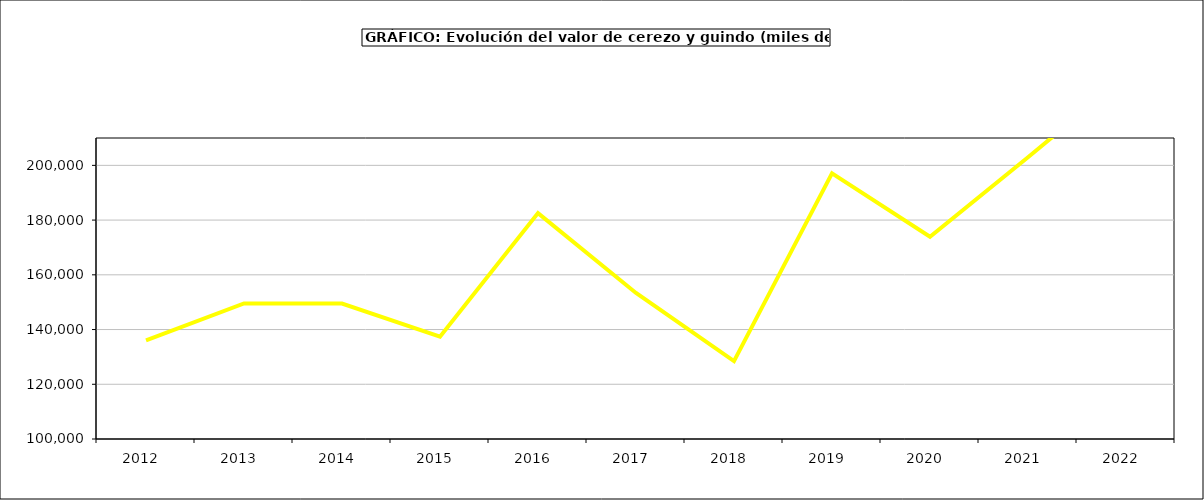
| Category | valor cerezo y guindo |
|---|---|
| 2012.0 | 136005.543 |
| 2013.0 | 149538.377 |
| 2014.0 | 149493.495 |
| 2015.0 | 137364 |
| 2016.0 | 182544 |
| 2017.0 | 153374.55 |
| 2018.0 | 128453.5 |
| 2019.0 | 197061.787 |
| 2020.0 | 173932.727 |
| 2021.0 | 202968.339 |
| 2022.0 | 232607.672 |